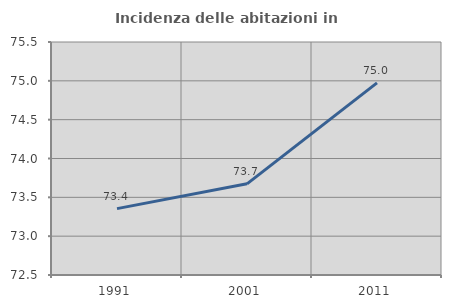
| Category | Incidenza delle abitazioni in proprietà  |
|---|---|
| 1991.0 | 73.355 |
| 2001.0 | 73.674 |
| 2011.0 | 74.974 |